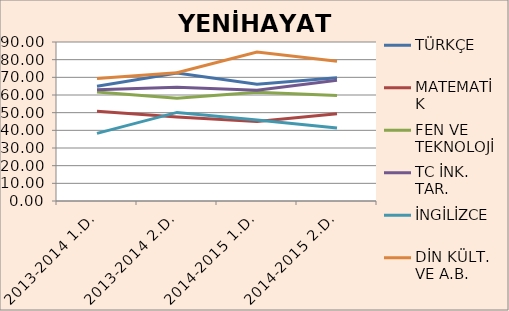
| Category | TÜRKÇE | MATEMATİK | FEN VE TEKNOLOJİ | TC İNK. TAR. | İNGİLİZCE | DİN KÜLT. VE A.B. |
|---|---|---|---|---|---|---|
| 2013-2014 1.D. | 64.95 | 50.8 | 61.76 | 62.94 | 38.3 | 69.36 |
| 2013-2014 2.D. | 72.41 | 47.55 | 58.14 | 64.45 | 50.14 | 72.64 |
| 2014-2015 1.D. | 66.06 | 45 | 61.56 | 62.72 | 45.83 | 84.28 |
| 2014-2015 2.D. | 69.78 | 49.33 | 59.78 | 68.31 | 41.29 | 79.16 |